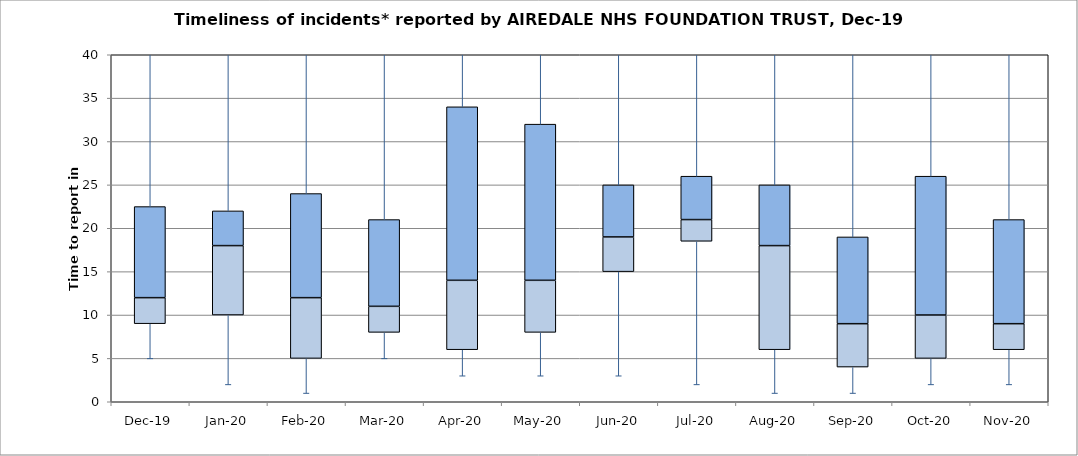
| Category | Series 0 | Series 1 | Series 2 |
|---|---|---|---|
| Dec-19 | 9 | 3 | 10.5 |
| Jan-20 | 10 | 8 | 4 |
| Feb-20 | 5 | 7 | 12 |
| Mar-20 | 8 | 3 | 10 |
| Apr-20 | 6 | 8 | 20 |
| May-20 | 8 | 6 | 18 |
| Jun-20 | 15 | 4 | 6 |
| Jul-20 | 18.5 | 2.5 | 5 |
| Aug-20 | 6 | 12 | 7 |
| Sep-20 | 4 | 5 | 10 |
| Oct-20 | 5 | 5 | 16 |
| Nov-20 | 6 | 3 | 12 |